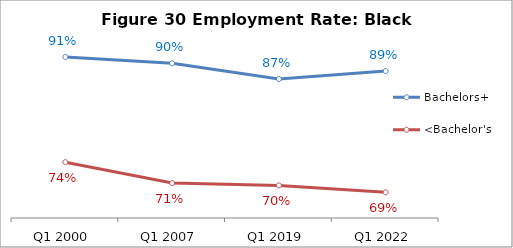
| Category | Bachelors+ | <Bachelor's |
|---|---|---|
| Q1 2000 | 0.908 | 0.74 |
| Q1 2007 | 0.898 | 0.706 |
| Q1 2019 | 0.873 | 0.702 |
| Q1 2022 | 0.886 | 0.691 |